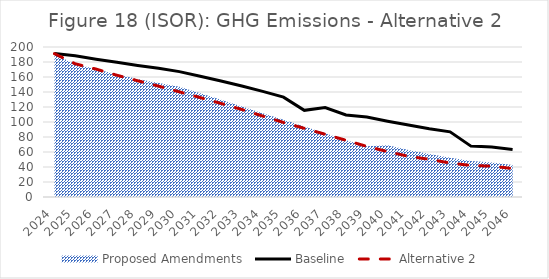
| Category | Baseline  | Alternative 2  |
|---|---|---|
| 2024.0 | 191.357 | 191.11 |
| 2025.0 | 188.439 | 177.619 |
| 2026.0 | 183.798 | 170.547 |
| 2027.0 | 179.753 | 162.338 |
| 2028.0 | 175.419 | 154.946 |
| 2029.0 | 171.532 | 147.799 |
| 2030.0 | 167.16 | 140.198 |
| 2031.0 | 161.031 | 132.555 |
| 2032.0 | 154.691 | 124.73 |
| 2033.0 | 148.038 | 116.669 |
| 2034.0 | 140.791 | 107.934 |
| 2035.0 | 133.188 | 99.384 |
| 2036.0 | 115.548 | 91.554 |
| 2037.0 | 119.355 | 83.666 |
| 2038.0 | 109.345 | 75.615 |
| 2039.0 | 106.623 | 67.452 |
| 2040.0 | 101.123 | 60.53 |
| 2041.0 | 95.876 | 54.198 |
| 2042.0 | 90.88 | 50.261 |
| 2043.0 | 86.822 | 45.312 |
| 2044.0 | 67.842 | 42.044 |
| 2045.0 | 66.703 | 41.09 |
| 2046.0 | 63.352 | 37.954 |